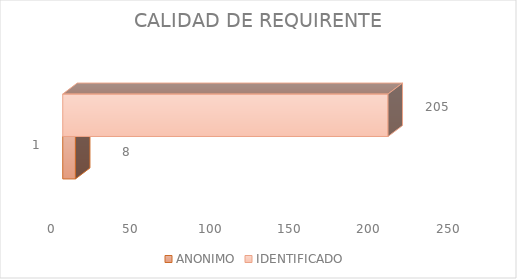
| Category | ANONIMO | IDENTIFICADO  |
|---|---|---|
| 0 | 8 | 205 |